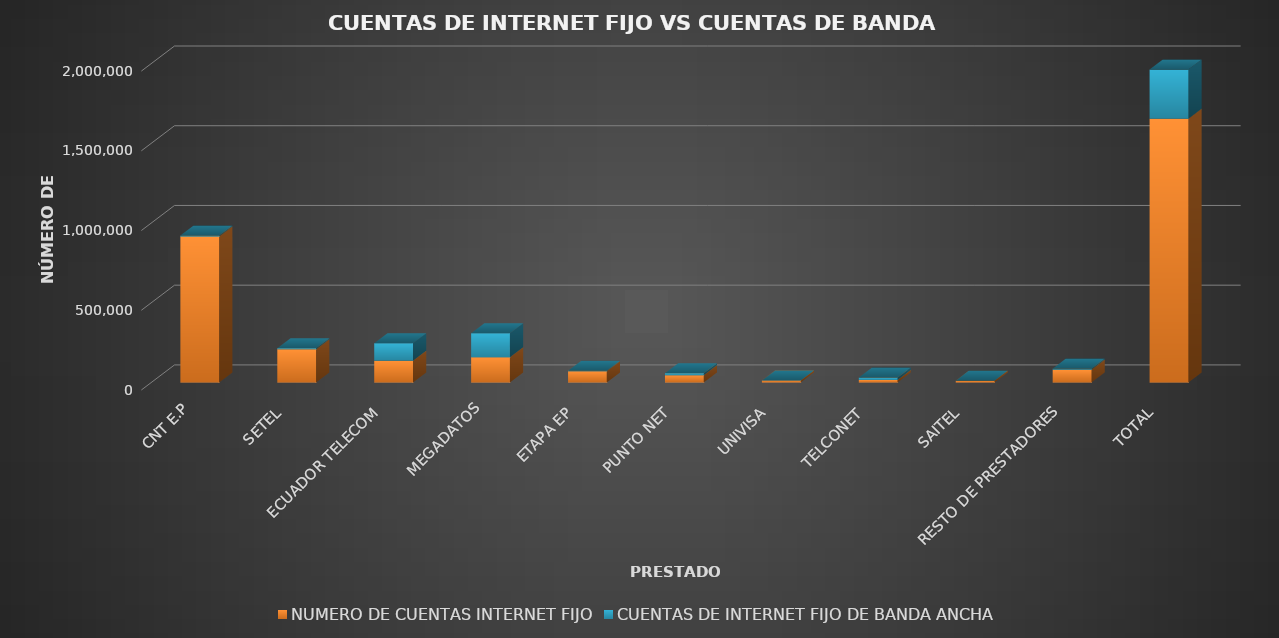
| Category | NUMERO DE CUENTAS INTERNET FIJO | CUENTAS DE INTERNET FIJO DE BANDA ANCHA |
|---|---|---|
| CNT E.P | 915919 | 5410 |
| SETEL | 208011 | 6795 |
| ECUADOR TELECOM | 136620 | 109615 |
| MEGADATOS | 157630 | 150466 |
| ETAPA EP | 70410 | 2381 |
| PUNTO NET | 45927 | 11263 |
| UNIVISA | 12543 | 0 |
| TELCONET | 15780 | 14966 |
| SAITEL | 11153 | 425 |
| RESTO DE PRESTADORES | 80080 | 6621 |
| TOTAL | 1654073 | 307942 |